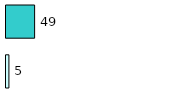
| Category | Series 0 | Series 1 |
|---|---|---|
| 0 | 5 | 49 |